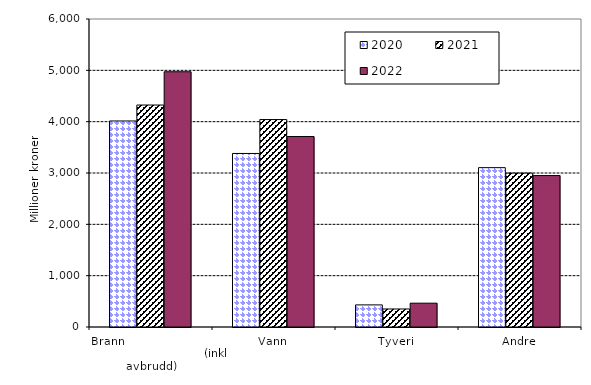
| Category | 2020 | 2021 | 2022 |
|---|---|---|---|
| Brann                                                       (inkl avbrudd) | 4013.568 | 4324.255 | 4972.151 |
| Vann | 3380.663 | 4041.101 | 3710.18 |
| Tyveri | 430.465 | 351.095 | 463.994 |
| Andre | 3104.204 | 2997.764 | 2950.034 |